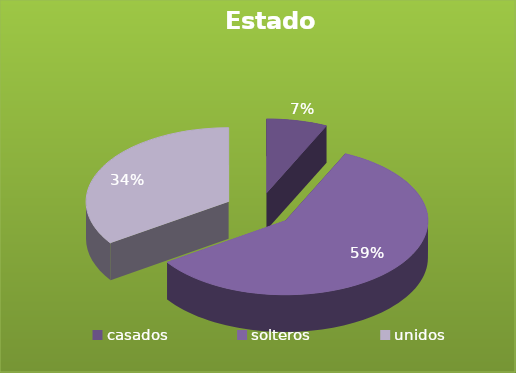
| Category | Series 0 |
|---|---|
| casados | 2 |
| solteros | 17 |
| unidos | 10 |